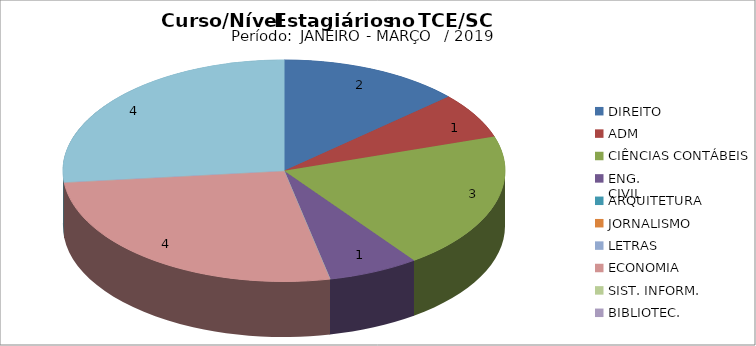
| Category | Series 0 |
|---|---|
| DIREITO | 2 |
| ADM | 1 |
| CIÊNCIAS CONTÁBEIS | 3 |
| ENG.
CIVIL | 1 |
| ARQUITETURA | 0 |
| JORNALISMO
 | 0 |
| LETRAS | 0 |
| ECONOMIA | 4 |
| SIST. INFORM. | 0 |
| BIBLIOTEC. | 0 |
| NÍVEL
MÉDIO  | 4 |